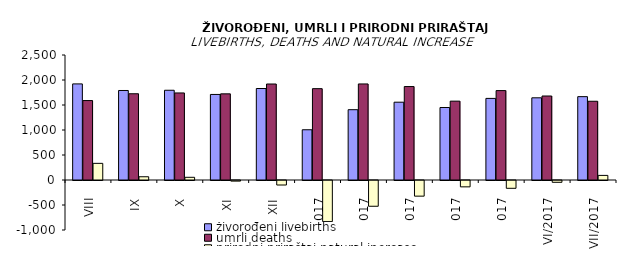
| Category | živorođeni livebirths | umrli deaths | prirodni priraštaj natural increase |
|---|---|---|---|
| VIII | 1922 | 1589 | 333 |
| IX | 1790 | 1725 | 65 |
| X | 1795 | 1741 | 54 |
| XI | 1711 | 1723 | -12 |
| XII | 1830 | 1920 | -90 |
| I/2017 | 1005 | 1827 | -822 |
| II/2017 | 1406 | 1921 | -515 |
| III/2017 | 1556 | 1869 | -313 |
| IV/2017 | 1450 | 1577 | -127 |
| V/2017 | 1632 | 1788 | -156 |
| VI/2017 | 1644 | 1680 | -36 |
| VII/2017 | 1667 | 1575 | 92 |